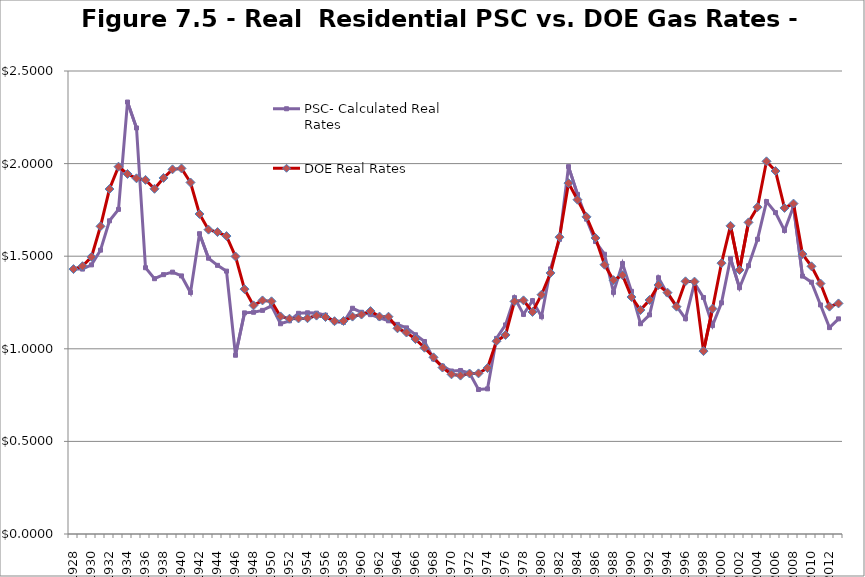
| Category | PSC- Calculated Real Rates | DOE Real Rates |
|---|---|---|
| 1928.0 | 1.43 | 1.43 |
| 1929.0 | 1.43 | 1.446 |
| 1930.0 | 1.453 | 1.496 |
| 1931.0 | 1.533 | 1.661 |
| 1932.0 | 1.691 | 1.863 |
| 1933.0 | 1.753 | 1.983 |
| 1934.0 | 2.332 | 1.944 |
| 1935.0 | 2.192 | 1.921 |
| 1936.0 | 1.438 | 1.912 |
| 1937.0 | 1.379 | 1.864 |
| 1938.0 | 1.4 | 1.922 |
| 1939.0 | 1.414 | 1.969 |
| 1940.0 | 1.394 | 1.974 |
| 1941.0 | 1.304 | 1.898 |
| 1942.0 | 1.622 | 1.728 |
| 1943.0 | 1.489 | 1.643 |
| 1944.0 | 1.451 | 1.63 |
| 1945.0 | 1.419 | 1.609 |
| 1946.0 | 0.965 | 1.499 |
| 1947.0 | 1.194 | 1.322 |
| 1948.0 | 1.197 | 1.235 |
| 1949.0 | 1.208 | 1.261 |
| 1950.0 | 1.232 | 1.256 |
| 1951.0 | 1.135 | 1.175 |
| 1952.0 | 1.151 | 1.163 |
| 1953.0 | 1.192 | 1.164 |
| 1954.0 | 1.194 | 1.165 |
| 1955.0 | 1.193 | 1.179 |
| 1956.0 | 1.182 | 1.172 |
| 1957.0 | 1.145 | 1.149 |
| 1958.0 | 1.142 | 1.15 |
| 1959.0 | 1.219 | 1.174 |
| 1960.0 | 1.197 | 1.185 |
| 1961.0 | 1.184 | 1.204 |
| 1962.0 | 1.167 | 1.174 |
| 1963.0 | 1.151 | 1.173 |
| 1964.0 | 1.132 | 1.111 |
| 1965.0 | 1.113 | 1.088 |
| 1966.0 | 1.076 | 1.053 |
| 1967.0 | 1.039 | 1.006 |
| 1968.0 | 0.945 | 0.954 |
| 1969.0 | 0.907 | 0.899 |
| 1970.0 | 0.88 | 0.862 |
| 1971.0 | 0.883 | 0.855 |
| 1972.0 | 0.869 | 0.867 |
| 1973.0 | 0.78 | 0.867 |
| 1974.0 | 0.784 | 0.896 |
| 1975.0 | 1.056 | 1.041 |
| 1976.0 | 1.129 | 1.075 |
| 1977.0 | 1.276 | 1.256 |
| 1978.0 | 1.186 | 1.262 |
| 1979.0 | 1.26 | 1.199 |
| 1980.0 | 1.173 | 1.292 |
| 1981.0 | 1.431 | 1.41 |
| 1982.0 | 1.591 | 1.603 |
| 1983.0 | 1.984 | 1.895 |
| 1984.0 | 1.834 | 1.805 |
| 1985.0 | 1.7 | 1.713 |
| 1986.0 | 1.579 | 1.598 |
| 1987.0 | 1.511 | 1.454 |
| 1988.0 | 1.305 | 1.371 |
| 1989.0 | 1.461 | 1.398 |
| 1990.0 | 1.31 | 1.28 |
| 1991.0 | 1.135 | 1.209 |
| 1992.0 | 1.183 | 1.264 |
| 1993.0 | 1.384 | 1.345 |
| 1994.0 | 1.296 | 1.303 |
| 1995.0 | 1.231 | 1.227 |
| 1996.0 | 1.162 | 1.364 |
| 1997.0 | 1.355 | 1.363 |
| 1998.0 | 1.277 | 0.988 |
| 1999.0 | 1.125 | 1.217 |
| 2000.0 | 1.248 | 1.462 |
| 2001.0 | 1.487 | 1.664 |
| 2002.0 | 1.33 | 1.426 |
| 2003.0 | 1.449 | 1.683 |
| 2004.0 | 1.591 | 1.765 |
| 2005.0 | 1.795 | 2.012 |
| 2006.0 | 1.735 | 1.96 |
| 2007.0 | 1.639 | 1.761 |
| 2008.0 | 1.769 | 1.784 |
| 2009.0 | 1.393 | 1.512 |
| 2010.0 | 1.36 | 1.445 |
| 2011.0 | 1.237 | 1.353 |
| 2012.0 | 1.114 | 1.228 |
| 2013.0 | 1.162 | 1.245 |